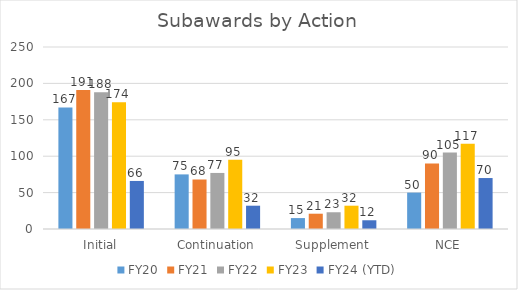
| Category | FY20 | FY21 | FY22 | FY23 | FY24 (YTD) |
|---|---|---|---|---|---|
| Initial | 167 | 191 | 188 | 174 | 66 |
| Continuation | 75 | 68 | 77 | 95 | 32 |
| Supplement | 15 | 21 | 23 | 32 | 12 |
| NCE | 50 | 90 | 105 | 117 | 70 |